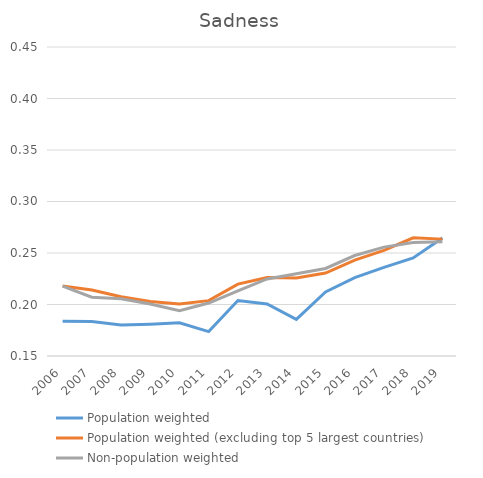
| Category | Population weighted | Population weighted (excluding top 5 largest countries) | Non-population weighted |
|---|---|---|---|
| 2006.0 | 0.184 | 0.218 | 0.218 |
| 2007.0 | 0.184 | 0.214 | 0.207 |
| 2008.0 | 0.18 | 0.207 | 0.206 |
| 2009.0 | 0.181 | 0.203 | 0.2 |
| 2010.0 | 0.182 | 0.201 | 0.194 |
| 2011.0 | 0.174 | 0.204 | 0.201 |
| 2012.0 | 0.204 | 0.22 | 0.213 |
| 2013.0 | 0.201 | 0.226 | 0.225 |
| 2014.0 | 0.186 | 0.226 | 0.23 |
| 2015.0 | 0.212 | 0.231 | 0.235 |
| 2016.0 | 0.226 | 0.243 | 0.248 |
| 2017.0 | 0.236 | 0.253 | 0.256 |
| 2018.0 | 0.245 | 0.265 | 0.26 |
| 2019.0 | 0.265 | 0.263 | 0.261 |